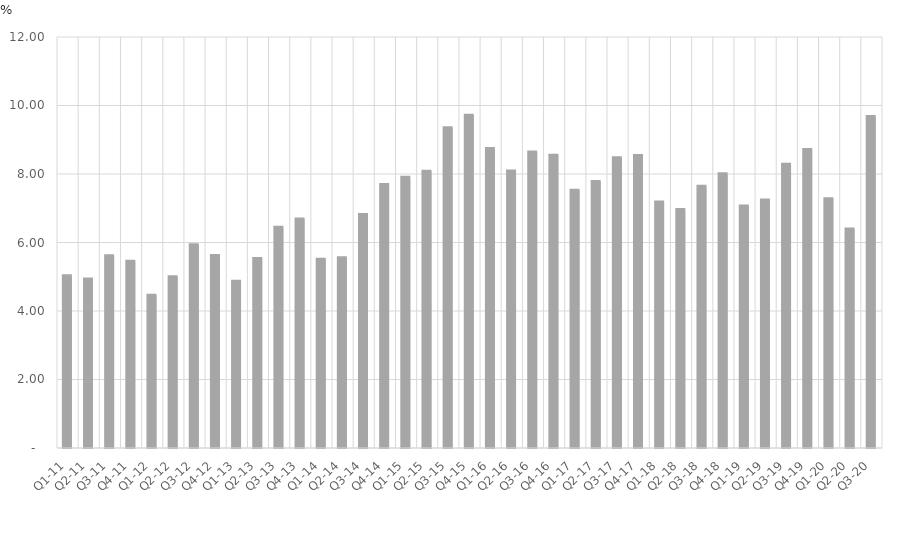
| Category | النسبة المئوية من الناتج المحلي الاجمالي
Percent of Total GDP |
|---|---|
| Q1-11 | 5.032 |
| Q2-11 | 4.933 |
| Q3-11 | 5.617 |
| Q4-11 | 5.453 |
| Q1-12 | 4.46 |
| Q2-12 | 5.002 |
| Q3-12 | 5.935 |
| Q4-12 | 5.624 |
| Q1-13 | 4.869 |
| Q2-13 | 5.534 |
| Q3-13 | 6.447 |
| Q4-13 | 6.685 |
| Q1-14 | 5.511 |
| Q2-14 | 5.553 |
| Q3-14 | 6.819 |
| Q4-14 | 7.691 |
| Q1-15 | 7.903 |
| Q2-15 | 8.077 |
| Q3-15 | 9.35 |
| Q4-15 | 9.715 |
| Q1-16 | 8.746 |
| Q2-16 | 8.084 |
| Q3-16 | 8.642 |
| Q4-16 | 8.548 |
| Q1-17 | 7.526 |
| Q2-17 | 7.783 |
| Q3-17 | 8.475 |
| Q4-17 | 8.539 |
| Q1-18 | 7.182 |
| Q2-18 | 6.964 |
| Q3-18 | 7.645 |
| Q4-18 | 8.009 |
| Q1-19 | 7.068 |
| Q2-19 | 7.239 |
| Q3-19 | 8.286 |
| Q4-19 | 8.716 |
| Q1-20 | 7.278 |
| Q2-20 | 6.397 |
| Q3-20 | 9.676 |